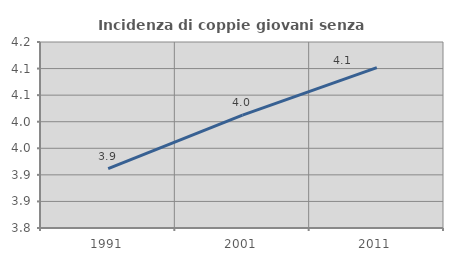
| Category | Incidenza di coppie giovani senza figli |
|---|---|
| 1991.0 | 3.912 |
| 2001.0 | 4.012 |
| 2011.0 | 4.102 |